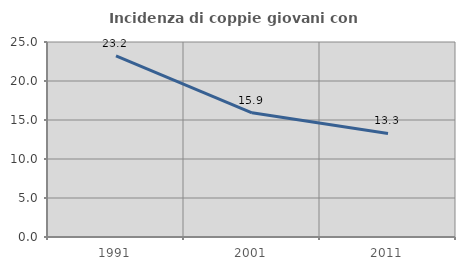
| Category | Incidenza di coppie giovani con figli |
|---|---|
| 1991.0 | 23.225 |
| 2001.0 | 15.924 |
| 2011.0 | 13.269 |